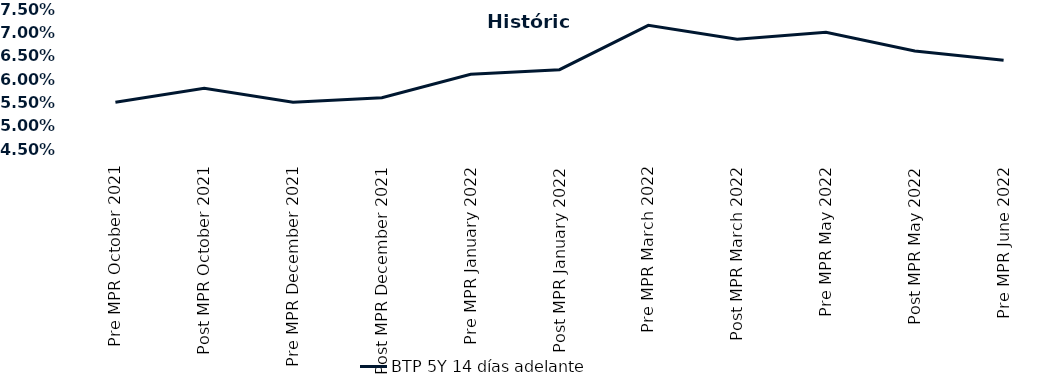
| Category | BTP 5Y 14 días adelante |
|---|---|
| Pre MPR October 2021 | 0.055 |
| Post MPR October 2021 | 0.058 |
| Pre MPR December 2021 | 0.055 |
| Post MPR December 2021 | 0.056 |
| Pre MPR January 2022 | 0.061 |
| Post MPR January 2022 | 0.062 |
| Pre MPR March 2022 | 0.072 |
| Post MPR March 2022 | 0.068 |
| Pre MPR May 2022 | 0.07 |
| Post MPR May 2022 | 0.066 |
| Pre MPR June 2022 | 0.064 |